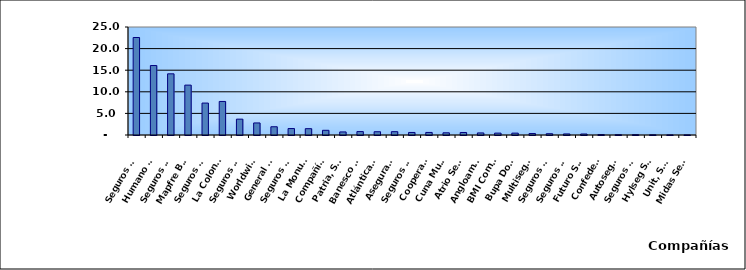
| Category | Series 0 |
|---|---|
| Seguros Universal, S. A. | 22.568 |
| Humano Seguros, S. A. | 16.078 |
| Seguros Reservas, S. A. | 14.161 |
| Mapfre BHD Compañía de Seguros | 11.546 |
| Seguros Sura, S.A. | 7.392 |
| La Colonial, S. A., Compañia De Seguros | 7.767 |
| Seguros Crecer, S. A. | 3.669 |
| Worldwide Seguros, S. A. | 2.79 |
| General de Seguros, S. A. | 1.91 |
| Seguros Pepín, S. A. | 1.492 |
| La Monumental de Seguros, S. A. | 1.462 |
| Compañía Dominicana de Seguros, C. por A. | 1.087 |
| Patria, S. A., Compañía de Seguros | 0.71 |
| Banesco Seguros | 0.791 |
| Atlántica Seguros, S. A. | 0.755 |
| Aseguradora Agropecuaria Dominicana, S. A. | 0.768 |
| Seguros La Internacional, S. A. | 0.589 |
| Cooperativa Nacional De Seguros, Inc  | 0.592 |
| Cuna Mutual Insurance Society Dominicana | 0.507 |
| Atrio Seguros S. A. | 0.581 |
| Angloamericana de Seguros, S. A. | 0.478 |
| BMI Compañía de Seguros, S. A. | 0.434 |
| Bupa Dominicana, S. A. | 0.432 |
| Multiseguros Su, S.A. | 0.34 |
| Seguros APS, S.R.L. | 0.294 |
| Seguros Ademi, S.A. | 0.248 |
| Futuro Seguros | 0.228 |
| Confederación del Canadá Dominicana, S. A. | 0.103 |
| Autoseguro, S. A. | 0.066 |
| Seguros Yunen, S.A. | 0.075 |
| Hylseg Seguros S.A | 0.044 |
| Unit, S.A. | 0.024 |
| Midas Seguros, S.A. | 0.02 |